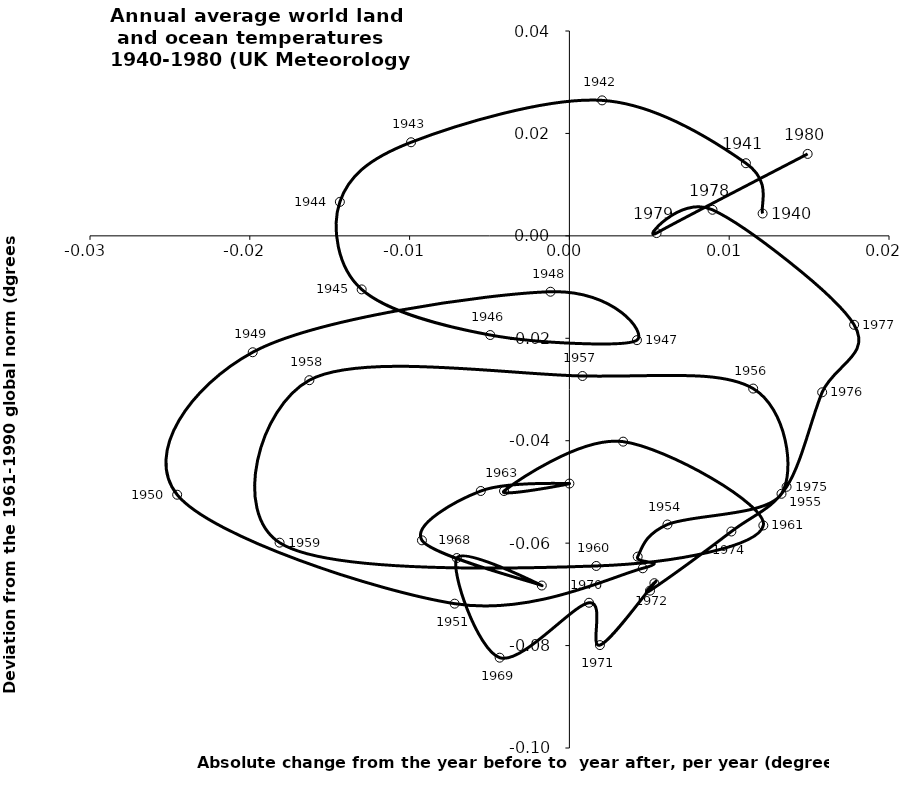
| Category | Series 0 |
|---|---|
| 0.01209090909090909 | 0.004 |
| 0.011045454545454546 | 0.014 |
| 0.0020454545454545447 | 0.026 |
| -0.009909090909090907 | 0.018 |
| -0.014363636363636363 | 0.007 |
| -0.013000000000000003 | -0.01 |
| -0.004954545454545455 | -0.019 |
| 0.004227272727272726 | -0.02 |
| -0.0011818181818181867 | -0.011 |
| -0.019818181818181825 | -0.023 |
| -0.024545454545454544 | -0.051 |
| -0.007181818181818178 | -0.072 |
| 0.00459090909090909 | -0.065 |
| 0.004272727272727275 | -0.063 |
| 0.006136363636363641 | -0.056 |
| 0.013272727272727278 | -0.05 |
| 0.011500000000000002 | -0.03 |
| 0.0008181818181818169 | -0.027 |
| -0.016272727272727272 | -0.028 |
| -0.018136363636363634 | -0.06 |
| 0.0016818181818181836 | -0.064 |
| 0.012136363636363633 | -0.057 |
| 0.003363636363636364 | -0.04 |
| -0.0040909090909090895 | -0.05 |
| 0.0 | -0.048 |
| -0.005545454545454544 | -0.05 |
| -0.009227272727272726 | -0.059 |
| -0.0017272727272727266 | -0.068 |
| -0.007045454545454549 | -0.063 |
| -0.004363636363636368 | -0.082 |
| 0.0012272727272727227 | -0.072 |
| 0.001909090909090909 | -0.08 |
| 0.005318181818181819 | -0.068 |
| 0.005045454545454544 | -0.069 |
| 0.010136363636363638 | -0.058 |
| 0.013590909090909096 | -0.049 |
| 0.01581818181818182 | -0.031 |
| 0.017818181818181816 | -0.017 |
| 0.008954545454545455 | 0.005 |
| 0.005454545454545453 | 0.001 |
| 0.014909090909090907 | 0.016 |